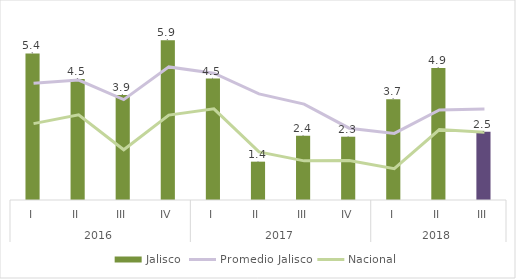
| Category | Jalisco |
|---|---|
| 0 | 5.399 |
| 1 | 4.462 |
| 2 | 3.868 |
| 3 | 5.886 |
| 4 | 4.474 |
| 5 | 1.413 |
| 6 | 2.364 |
| 7 | 2.332 |
| 8 | 3.711 |
| 9 | 4.864 |
| 10 | 2.512 |